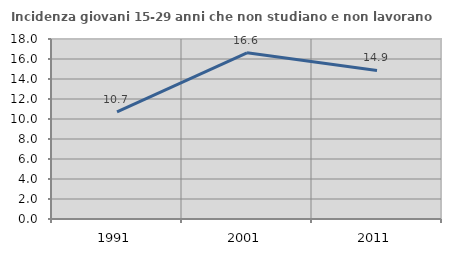
| Category | Incidenza giovani 15-29 anni che non studiano e non lavorano  |
|---|---|
| 1991.0 | 10.714 |
| 2001.0 | 16.617 |
| 2011.0 | 14.856 |